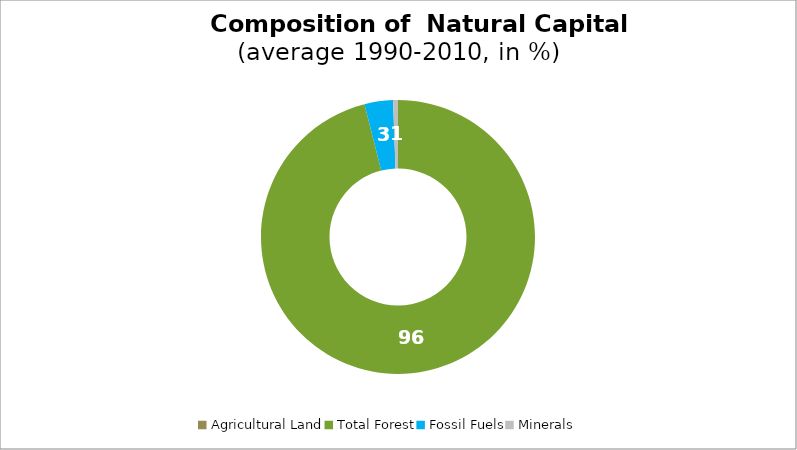
| Category | Series 0 |
|---|---|
| Agricultural Land | 0 |
| Total Forest | 96.064 |
| Fossil Fuels | 3.361 |
| Minerals | 0.576 |